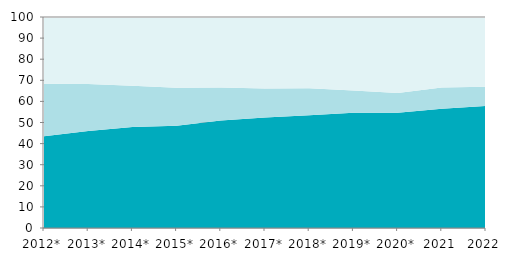
| Category | Запослени | Незапослени | Становништво ван радне снаге |
|---|---|---|---|
| 2012* | 43.52 | 24.796 | 42.131 |
| 2013* | 45.977 | 22.29 | 40.835 |
| 2014* | 47.838 | 19.604 | 40.497 |
| 2015* | 48.452 | 17.994 | 40.916 |
| 2016* | 50.965 | 15.651 | 39.578 |
| 2017* | 52.37 | 13.792 | 39.252 |
| 2018* | 53.461 | 12.829 | 38.671 |
| 2019* | 54.632 | 10.588 | 38.898 |
| 2020* | 54.66 | 9.363 | 39.693 |
| 2021 | 56.467 | 10.16 | 37.147 |
| 2022 | 57.9 | 9 | 36.4 |